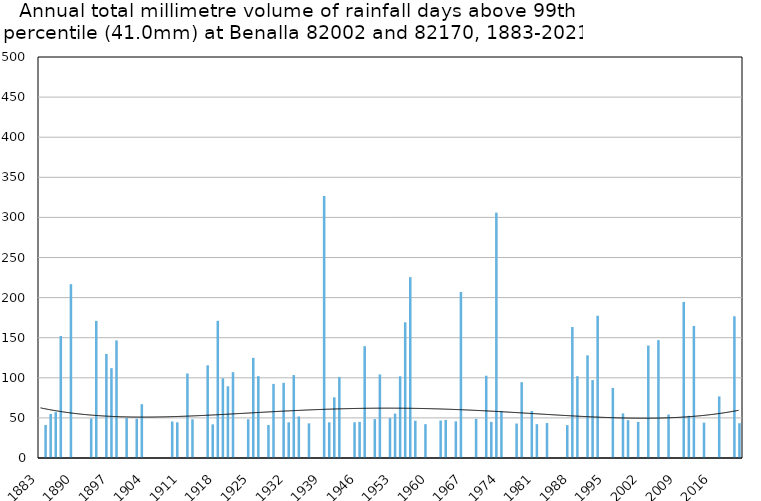
| Category | Annual total mm in days above 99th percentile |
|---|---|
| 1883 | 0 |
| 1884 | 41.1 |
| 1885 | 54.9 |
| 1886 | 57.2 |
| 1887 | 152.1 |
| 1888 | 0 |
| 1889 | 216.7 |
| 1890 | 0 |
| 1891 | 0 |
| 1892 | 0 |
| 1893 | 49.3 |
| 1894 | 171 |
| 1895 | 0 |
| 1896 | 129.8 |
| 1897 | 112 |
| 1898 | 146.6 |
| 1899 | 0 |
| 1900 | 49.8 |
| 1901 | 0 |
| 1902 | 49 |
| 1903 | 67.1 |
| 1904 | 0 |
| 1905 | 0 |
| 1906 | 0 |
| 1907 | 0 |
| 1908 | 0 |
| 1909 | 45.5 |
| 1910 | 44.5 |
| 1911 | 0 |
| 1912 | 105.4 |
| 1913 | 48.3 |
| 1914 | 0 |
| 1915 | 0 |
| 1916 | 115.6 |
| 1917 | 41.9 |
| 1918 | 171 |
| 1919 | 99.4 |
| 1920 | 89.4 |
| 1921 | 107 |
| 1922 | 0 |
| 1923 | 0 |
| 1924 | 48.3 |
| 1925 | 124.9 |
| 1926 | 102.1 |
| 1927 | 0 |
| 1928 | 41.1 |
| 1929 | 92.4 |
| 1930 | 0 |
| 1931 | 93.7 |
| 1932 | 44.5 |
| 1933 | 103.4 |
| 1934 | 51.8 |
| 1935 | 0 |
| 1936 | 43.2 |
| 1937 | 0 |
| 1938 | 0 |
| 1939 | 326.8 |
| 1940 | 44.5 |
| 1941 | 75.7 |
| 1942 | 101.1 |
| 1943 | 0 |
| 1944 | 0 |
| 1945 | 44.5 |
| 1946 | 45 |
| 1947 | 139.4 |
| 1948 | 0 |
| 1949 | 48.5 |
| 1950 | 104.2 |
| 1951 | 0 |
| 1952 | 49.8 |
| 1953 | 55.4 |
| 1954 | 101.9 |
| 1955 | 169.2 |
| 1956 | 225.5 |
| 1957 | 46.5 |
| 1958 | 0 |
| 1959 | 42.2 |
| 1960 | 0 |
| 1961 | 0 |
| 1962 | 46.7 |
| 1963 | 47.5 |
| 1964 | 0 |
| 1965 | 45.7 |
| 1966 | 207 |
| 1967 | 0 |
| 1968 | 0 |
| 1969 | 48.8 |
| 1970 | 0 |
| 1971 | 102.6 |
| 1972 | 45 |
| 1973 | 305.9 |
| 1974 | 58.7 |
| 1975 | 0 |
| 1976 | 0 |
| 1977 | 43 |
| 1978 | 94.6 |
| 1979 | 0 |
| 1980 | 58.6 |
| 1981 | 42.2 |
| 1982 | 0 |
| 1983 | 43.6 |
| 1984 | 0 |
| 1985 | 0 |
| 1986 | 0 |
| 1987 | 41 |
| 1988 | 163.3 |
| 1989 | 102 |
| 1990 | 0 |
| 1991 | 128 |
| 1992 | 97.2 |
| 1993 | 177.4 |
| 1994 | 0 |
| 1995 | 0 |
| 1996 | 87.4 |
| 1997 | 0 |
| 1998 | 55.6 |
| 1999 | 47.2 |
| 2000 | 0 |
| 2001 | 45 |
| 2002 | 0 |
| 2003 | 140.2 |
| 2004 | 0 |
| 2005 | 147 |
| 2006 | 0 |
| 2007 | 54.2 |
| 2008 | 0 |
| 2009 | 0 |
| 2010 | 194.6 |
| 2011 | 52.6 |
| 2012 | 164.7 |
| 2013 | 0 |
| 2014 | 44.1 |
| 2015 | 0 |
| 2016 | 0 |
| 2017 | 76.8 |
| 2018 | 0 |
| 2019 | 0 |
| 2020 | 176.7 |
| 2021 | 43.4 |